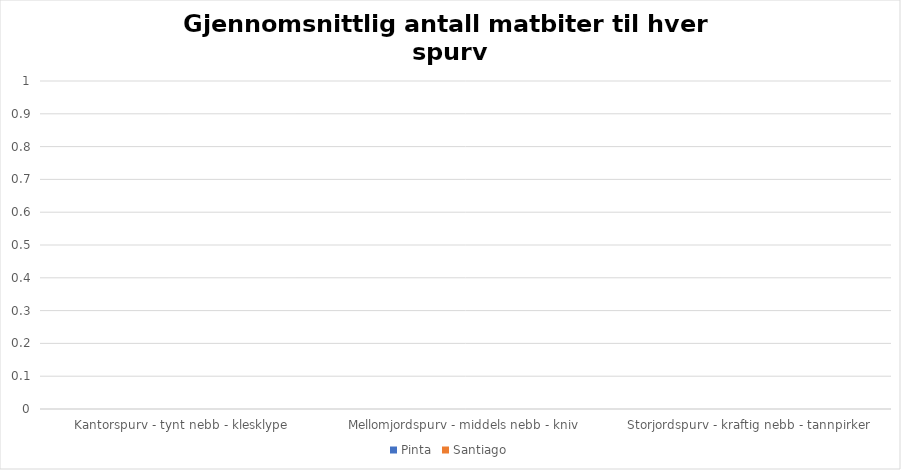
| Category | Pinta | Santiago |
|---|---|---|
| Kantorspurv - tynt nebb - klesklype | 0 | 0 |
| Mellomjordspurv - middels nebb - kniv | 0 | 0 |
| Storjordspurv - kraftig nebb - tannpirker | 0 | 0 |